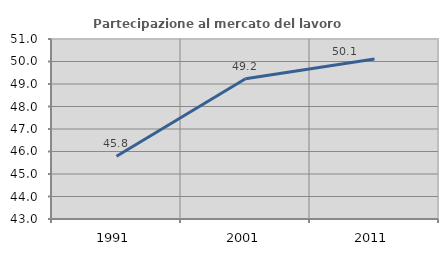
| Category | Partecipazione al mercato del lavoro  femminile |
|---|---|
| 1991.0 | 45.791 |
| 2001.0 | 49.235 |
| 2011.0 | 50.115 |